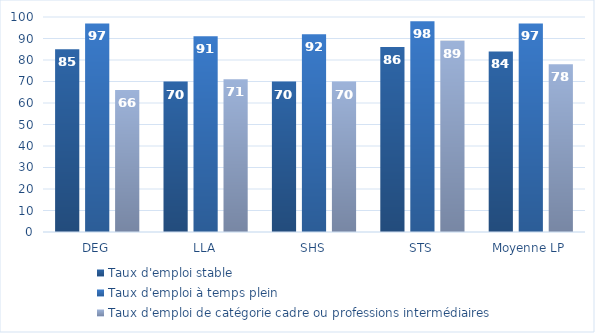
| Category | Taux d'emploi stable | Taux d'emploi à temps plein | Taux d'emploi de catégorie cadre ou professions intermédiaires |
|---|---|---|---|
| DEG | 85 | 97 | 66 |
| LLA | 70 | 91 | 71 |
| SHS | 70 | 92 | 70 |
| STS | 86 | 98 | 89 |
| Moyenne LP | 84 | 97 | 78 |